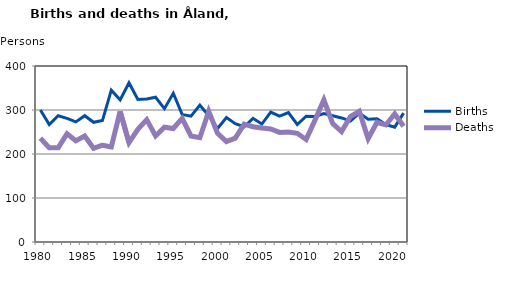
| Category | Births | Deaths |
|---|---|---|
| 1980.0 | 300 | 236 |
| 1981.0 | 267 | 214 |
| 1982.0 | 287 | 214 |
| 1983.0 | 281 | 246 |
| 1984.0 | 273 | 230 |
| 1985.0 | 287 | 241 |
| 1986.0 | 272 | 213 |
| 1987.0 | 276 | 220 |
| 1988.0 | 345 | 216 |
| 1989.0 | 323 | 297 |
| 1990.0 | 362 | 226 |
| 1991.0 | 324 | 256 |
| 1992.0 | 325 | 278 |
| 1993.0 | 329 | 241 |
| 1994.0 | 303 | 261 |
| 1995.0 | 338 | 258 |
| 1996.0 | 290 | 281 |
| 1997.0 | 286 | 241 |
| 1998.0 | 311 | 237 |
| 1999.0 | 287 | 297 |
| 2000.0 | 258 | 247 |
| 2001.0 | 283 | 228 |
| 2002.0 | 269 | 236 |
| 2003.0 | 262 | 268 |
| 2004.0 | 281 | 262 |
| 2005.0 | 268 | 259 |
| 2006.0 | 295 | 257 |
| 2007.0 | 286 | 249 |
| 2008.0 | 294 | 250 |
| 2009.0 | 267 | 247 |
| 2010.0 | 286 | 233 |
| 2011.0 | 285 | 277 |
| 2012.0 | 292 | 323 |
| 2013.0 | 287 | 269 |
| 2014.0 | 282 | 251 |
| 2015.0 | 275 | 285 |
| 2016.0 | 293 | 297 |
| 2017.0 | 279 | 235 |
| 2018.0 | 280 | 272 |
| 2019.0 | 267 | 266 |
| 2020.0 | 261 | 291 |
| 2021.0 | 293 | 263 |